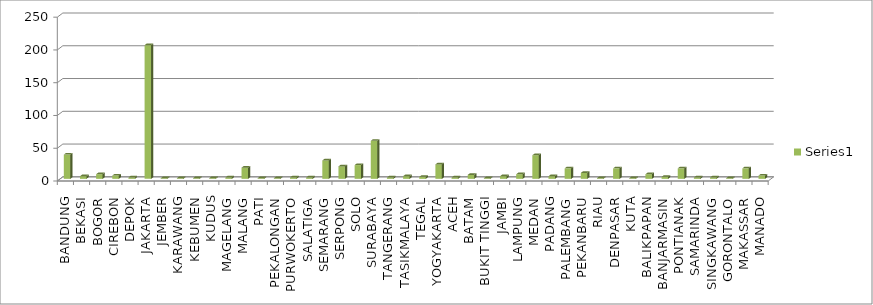
| Category | Series 0 |
|---|---|
| BANDUNG | 37 |
| BEKASI | 4 |
| BOGOR | 7 |
| CIREBON | 5 |
| DEPOK | 2 |
| JAKARTA | 204 |
| JEMBER | 1 |
| KARAWANG | 1 |
| KEBUMEN | 1 |
| KUDUS | 1 |
| MAGELANG | 2 |
| MALANG | 17 |
| PATI | 1 |
| PEKALONGAN | 1 |
| PURWOKERTO | 2 |
| SALATIGA | 2 |
| SEMARANG | 28 |
| SERPONG | 19 |
| SOLO | 21 |
| SURABAYA | 58 |
| TANGERANG | 2 |
| TASIKMALAYA | 4 |
| TEGAL | 3 |
| YOGYAKARTA | 22 |
| ACEH | 2 |
| BATAM | 6 |
| BUKIT TINGGI | 1 |
| JAMBI | 4 |
| LAMPUNG | 7 |
| MEDAN | 36 |
| PADANG | 4 |
| PALEMBANG | 16 |
| PEKANBARU | 9 |
| RIAU | 1 |
| DENPASAR | 16 |
| KUTA | 1 |
| BALIKPAPAN | 7 |
| BANJARMASIN | 3 |
| PONTIANAK | 16 |
| SAMARINDA | 2 |
| SINGKAWANG | 2 |
| GORONTALO | 1 |
| MAKASSAR | 16 |
| MANADO | 5 |